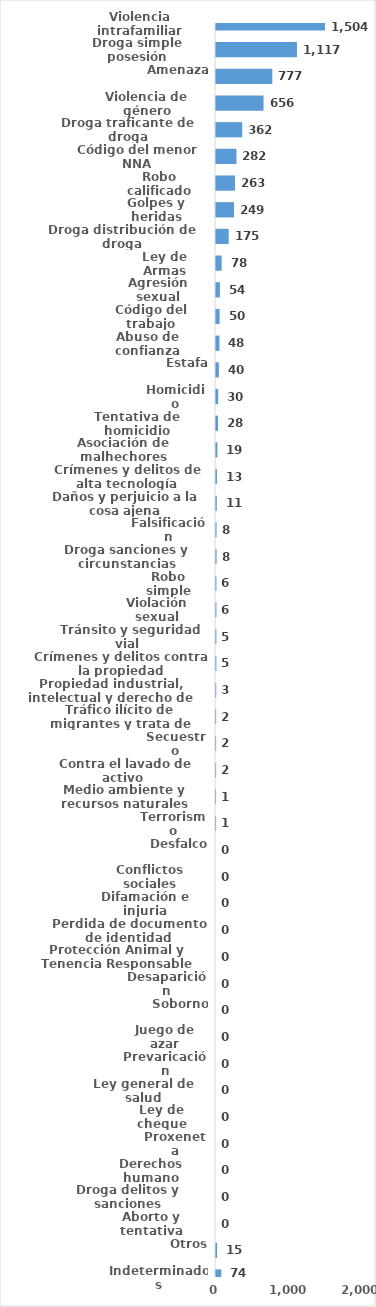
| Category | Series 0 |
|---|---|
| Violencia intrafamiliar | 1504 |
| Droga simple posesión | 1117 |
| Amenaza | 777 |
| Violencia de género | 656 |
| Droga traficante de droga | 362 |
| Código del menor NNA | 282 |
| Robo calificado | 263 |
| Golpes y heridas | 249 |
| Droga distribución de droga | 175 |
| Ley de Armas | 78 |
| Agresión sexual | 54 |
| Código del trabajo | 50 |
| Abuso de confianza | 48 |
| Estafa | 40 |
| Homicidio | 30 |
| Tentativa de homicidio | 28 |
| Asociación de malhechores | 19 |
| Crímenes y delitos de alta tecnología | 13 |
| Daños y perjuicio a la cosa ajena | 11 |
| Falsificación | 8 |
| Droga sanciones y circunstancias agravantes | 8 |
| Robo simple | 6 |
| Violación sexual | 6 |
| Tránsito y seguridad vial  | 5 |
| Crímenes y delitos contra la propiedad | 5 |
| Propiedad industrial, intelectual y derecho de autor | 3 |
| Tráfico ilícito de migrantes y trata de personas | 2 |
| Secuestro | 2 |
| Contra el lavado de activo  | 2 |
| Medio ambiente y recursos naturales | 1 |
| Terrorismo | 1 |
| Desfalco | 0 |
| Conflictos sociales | 0 |
| Difamación e injuria | 0 |
| Perdida de documento de identidad | 0 |
| Protección Animal y Tenencia Responsable | 0 |
| Desaparición | 0 |
| Soborno | 0 |
| Juego de azar | 0 |
| Prevaricación | 0 |
| Ley general de salud | 0 |
| Ley de cheque | 0 |
| Proxeneta | 0 |
| Derechos humano | 0 |
| Droga delitos y sanciones | 0 |
| Aborto y tentativa | 0 |
| Otros | 15 |
| Indeterminados | 74 |